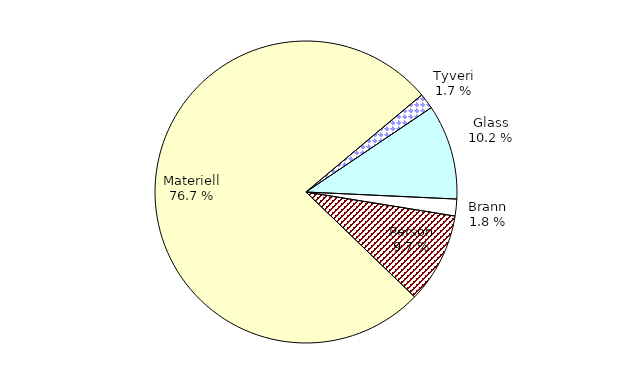
| Category | Series 0 |
|---|---|
| Tyveri | 135.29 |
| Glass | 818.79 |
| Brann | 145.161 |
| Person | 778.141 |
| Materiell | 6169.16 |